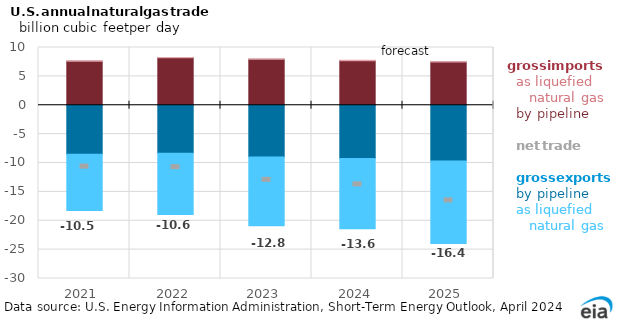
| Category | pipeline imports | LNG imports | pipeline exports | LNG exports |
|---|---|---|---|---|
| 2021.0 | 7.633 | 0.059 | -8.471 | -9.756 |
| 2022.0 | 8.215 | 0.069 | -8.324 | -10.591 |
| 2023.0 | 7.983 | 0.042 | -8.952 | -11.9 |
| 2024.0 | 7.723 | 0.059 | -9.239 | -12.151 |
| 2025.0 | 7.495 | 0.059 | -9.643 | -14.296 |